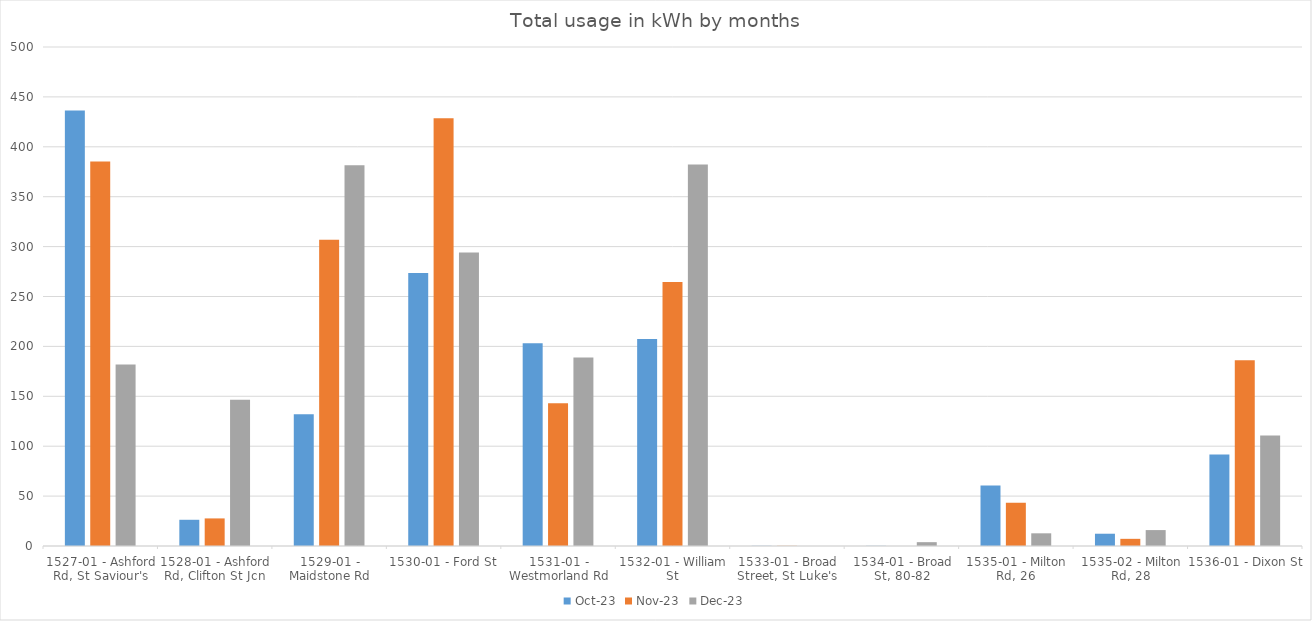
| Category | Oct-23 | Nov-23 | Dec-23 |
|---|---|---|---|
| 1527-01 - Ashford Rd, St Saviour's | 436.35 | 385.38 | 181.9 |
| 1528-01 - Ashford Rd, Clifton St Jcn | 26.27 | 27.64 | 146.42 |
| 1529-01 - Maidstone Rd | 131.92 | 306.78 | 381.61 |
| 1530-01 - Ford St | 273.51 | 428.55 | 294.01 |
| 1531-01 - Westmorland Rd | 203.12 | 142.97 | 188.91 |
| 1532-01 - William St | 207.43 | 264.53 | 382.38 |
| 1533-01 - Broad Street, St Luke's | 0.166 | 0.169 | 0 |
| 1534-01 - Broad St, 80-82 | 0.16 | 0 | 3.84 |
| 1535-01 - Milton Rd, 26 | 60.64 | 43.3 | 12.71 |
| 1535-02 - Milton Rd, 28 | 12.3 | 7.18 | 15.95 |
| 1536-01 - Dixon St | 91.67 | 186.08 | 110.82 |